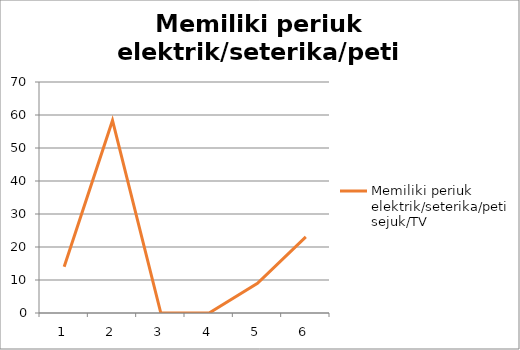
| Category | Memiliki periuk elektrik/seterika/peti sejuk/TV  |
|---|---|
| 0 | 14 |
| 1 | 58.333 |
| 2 | 0 |
| 3 | 0 |
| 4 | 9 |
| 5 | 23.077 |